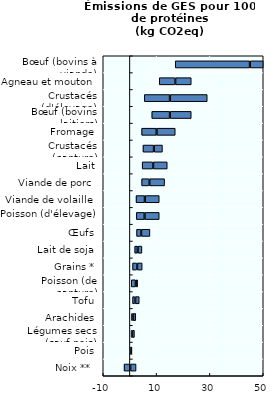
| Category | Espace blanc (10ème percentile) | Du 10ème percentile à la moyenne | Moyenne | De la moyenne au 90ème percentile |
|---|---|---|---|---|
| Noix **  | 0 | -2.2 | 0.26 | 2.05 |
| Pois | 0.25 | 0.06 | 0.26 | 0.18 |
| Légumes secs (sauf pois) | 0.45 | 0.25 | 0.26 | 0.74 |
| Arachides | 0.61 | 0.46 | 0.26 | 0.87 |
| Tofu | 1 | 0.87 | 0.26 | 1.37 |
| Poisson (de capture) | 0.5 | 1.57 | 0.26 | 0.57 |
| Grains * | 1 | 1.57 | 0.26 | 1.77 |
| Lait de soja | 1.8 | 0.97 | 0.26 | 1.47 |
| Œufs | 2.5 | 1.57 | 0.26 | 3.17 |
| Poisson (d'élevage) | 2.4 | 2.97 | 0.26 | 5.37 |
| Viande de volaille | 2.3 | 3.17 | 0.26 | 5.27 |
| Viande de porc | 4.4 | 2.77 | 0.26 | 5.57 |
| Lait | 4.6 | 3.97 | 0.26 | 5.17 |
| Crustacés (capture) | 4.9 | 3.97 | 0.26 | 3.07 |
| Fromage | 4.4 | 5.47 | 0.26 | 6.87 |
| Bœuf (bovins laitiers) | 8.2 | 6.67 | 0.26 | 7.87 |
| Crustacés (d'élevage) | 5.4 | 9.47 | 0.26 | 13.87 |
| Agneau et mouton | 11 | 5.87 | 0.26 | 5.87 |
| Bœuf (bovins à viande) | 17 | 27.87 | 0.26 | 48.87 |